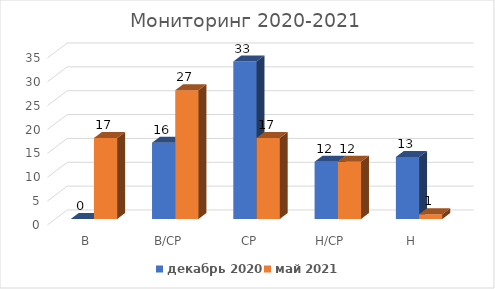
| Category | декабрь 2020 | май 2021 |
|---|---|---|
| В | 0 | 17 |
| В/СР | 16 | 27 |
| СР | 33 | 17 |
| Н/СР | 12 | 12 |
| Н | 13 | 1 |